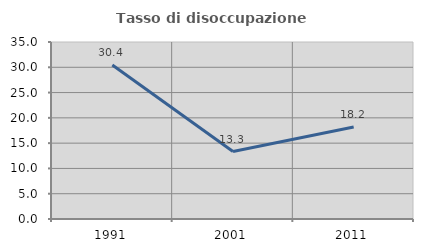
| Category | Tasso di disoccupazione giovanile  |
|---|---|
| 1991.0 | 30.435 |
| 2001.0 | 13.333 |
| 2011.0 | 18.182 |